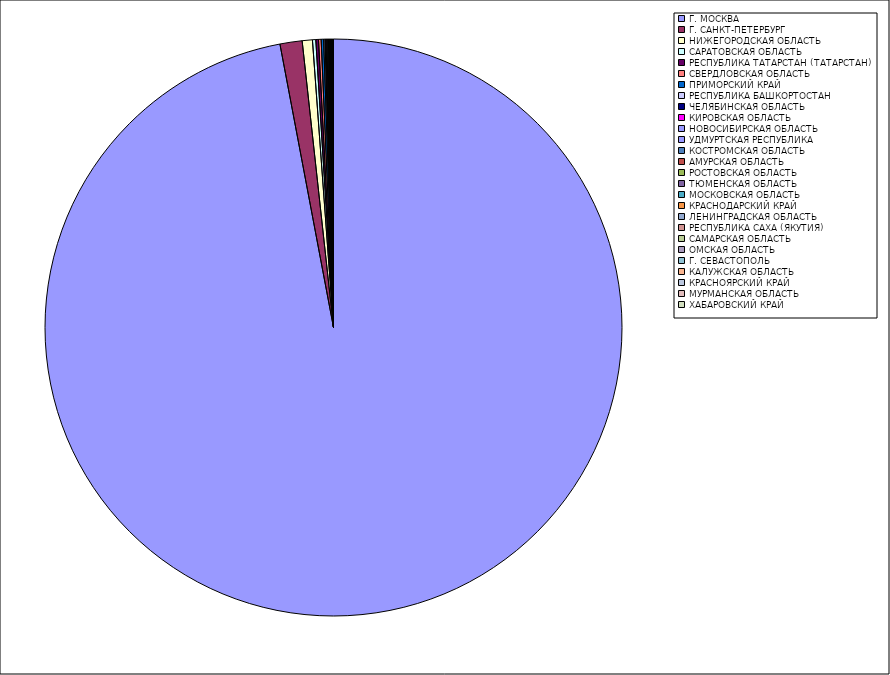
| Category | Оборот |
|---|---|
| Г. МОСКВА | 96.971 |
| Г. САНКТ-ПЕТЕРБУРГ | 1.238 |
| НИЖЕГОРОДСКАЯ ОБЛАСТЬ | 0.57 |
| САРАТОВСКАЯ ОБЛАСТЬ | 0.186 |
| РЕСПУБЛИКА ТАТАРСТАН (ТАТАРСТАН) | 0.149 |
| СВЕРДЛОВСКАЯ ОБЛАСТЬ | 0.147 |
| ПРИМОРСКИЙ КРАЙ | 0.136 |
| РЕСПУБЛИКА БАШКОРТОСТАН | 0.075 |
| ЧЕЛЯБИНСКАЯ ОБЛАСТЬ | 0.054 |
| КИРОВСКАЯ ОБЛАСТЬ | 0.048 |
| НОВОСИБИРСКАЯ ОБЛАСТЬ | 0.048 |
| УДМУРТСКАЯ РЕСПУБЛИКА | 0.043 |
| КОСТРОМСКАЯ ОБЛАСТЬ | 0.036 |
| АМУРСКАЯ ОБЛАСТЬ | 0.034 |
| РОСТОВСКАЯ ОБЛАСТЬ | 0.028 |
| ТЮМЕНСКАЯ ОБЛАСТЬ | 0.026 |
| МОСКОВСКАЯ ОБЛАСТЬ | 0.023 |
| КРАСНОДАРСКИЙ КРАЙ | 0.023 |
| ЛЕНИНГРАДСКАЯ ОБЛАСТЬ | 0.02 |
| РЕСПУБЛИКА САХА (ЯКУТИЯ) | 0.019 |
| САМАРСКАЯ ОБЛАСТЬ | 0.012 |
| ОМСКАЯ ОБЛАСТЬ | 0.012 |
| Г. СЕВАСТОПОЛЬ | 0.011 |
| КАЛУЖСКАЯ ОБЛАСТЬ | 0.011 |
| КРАСНОЯРСКИЙ КРАЙ | 0.009 |
| МУРМАНСКАЯ ОБЛАСТЬ | 0.009 |
| ХАБАРОВСКИЙ КРАЙ | 0.005 |